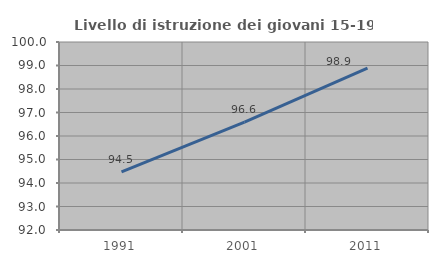
| Category | Livello di istruzione dei giovani 15-19 anni |
|---|---|
| 1991.0 | 94.474 |
| 2001.0 | 96.591 |
| 2011.0 | 98.889 |